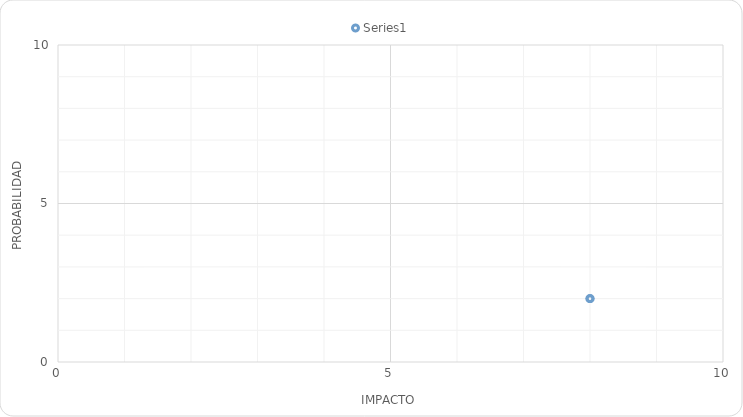
| Category | Series 0 |
|---|---|
| 8.0 | 2 |
| 8.0 | 2 |